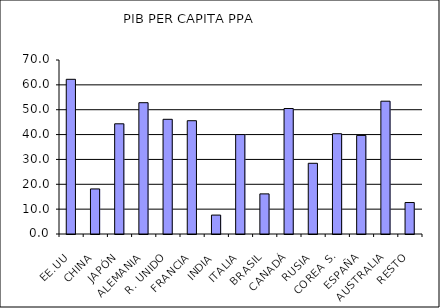
| Category | Series 0 |
|---|---|
| EE.UU | 62.235 |
| CHINA | 18.131 |
| JAPÓN | 44.331 |
| ALEMANIA | 52.826 |
| R. UNIDO | 46.14 |
| FRANCIA | 45.579 |
| INDIA | 7.608 |
| ITALIA | 40 |
| BRASIL | 16.138 |
| CANADÁ | 50.477 |
| RUSIA | 28.449 |
| COREA S. | 40.34 |
| ESPAÑA | 39.66 |
| AUSTRALIA | 53.426 |
| RESTO | 12.665 |